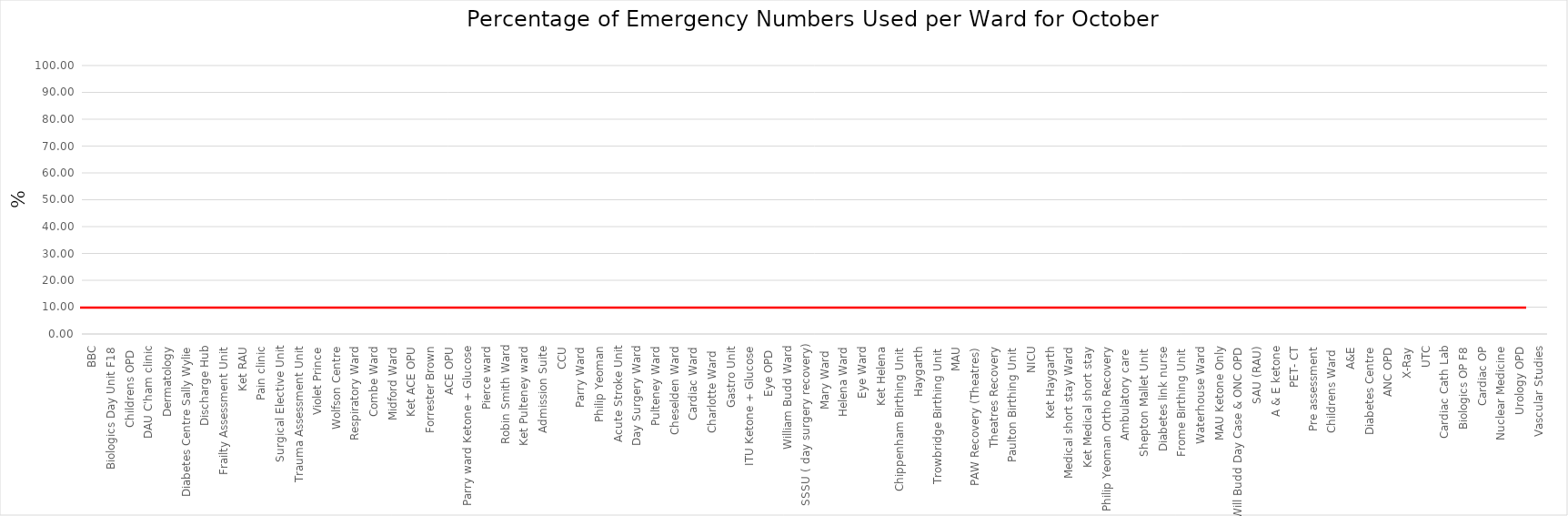
| Category | Series 0 |
|---|---|
| BBC | 0 |
| Biologics Day Unit F18 | 0 |
| Childrens OPD  | 0 |
| DAU C'ham clinic | 0 |
| Dermatology | 0 |
| Diabetes Centre Sally Wylie | 0 |
| Discharge Hub | 0 |
| Frailty Assessment Unit | 0 |
| Ket RAU | 0 |
| Pain clinic | 0 |
| Surgical Elective Unit | 0 |
| Trauma Assessment Unit | 0 |
| Violet Prince | 0 |
| Wolfson Centre | 0 |
| Respiratory Ward | 0 |
| Combe Ward | 0 |
| Midford Ward | 0 |
| Ket ACE OPU | 0 |
| Forrester Brown | 0 |
| ACE OPU | 0 |
| Parry ward Ketone + Glucose | 0 |
| Pierce ward | 0 |
| Robin Smith Ward | 0 |
| Ket Pulteney ward | 0 |
| Admission Suite | 0 |
| CCU | 0 |
| Parry Ward | 0 |
| Philip Yeoman | 0 |
| Acute Stroke Unit | 0 |
| Day Surgery Ward | 0 |
| Pulteney Ward | 0 |
| Cheselden Ward | 0 |
| Cardiac Ward | 0 |
| Charlotte Ward  | 0 |
| Gastro Unit | 0 |
| ITU Ketone + Glucose | 0 |
| Eye OPD  | 0 |
| William Budd Ward | 0 |
| SSSU ( day surgery recovery) | 0 |
| Mary Ward  | 0 |
| Helena Ward | 0 |
| Eye Ward | 0 |
| Ket Helena | 0 |
| Chippenham Birthing Unit  | 0 |
| Haygarth | 0 |
| Trowbridge Birthing Unit  | 0 |
| MAU | 0 |
| PAW Recovery (Theatres) | 0 |
| Theatres Recovery | 0 |
| Paulton Birthing Unit  | 0 |
| NICU | 0 |
| Ket Haygarth | 0 |
| Medical short stay Ward | 0 |
| Ket Medical short stay | 0 |
| Philip Yeoman Ortho Recovery | 0 |
| Ambulatory care  | 0 |
| Shepton Mallet Unit  | 0 |
| Diabetes link nurse | 0 |
| Frome Birthing Unit  | 0 |
| Waterhouse Ward | 0 |
| MAU Ketone Only | 0 |
| Will Budd Day Case & ONC OPD | 0 |
| SAU (RAU) | 0 |
| A & E ketone | 0 |
| PET- CT | 0 |
| Pre assessment | 0 |
| Childrens Ward  | 0 |
| A&E | 0 |
| Diabetes Centre | 0 |
| ANC OPD | 0 |
| X-Ray | 0 |
| UTC | 0 |
| Cardiac Cath Lab | 0 |
| Biologics OP F8 | 0 |
| Cardiac OP | 0 |
| Nuclear Medicine | 0 |
| Urology OPD | 0 |
| Vascular Studies | 0 |